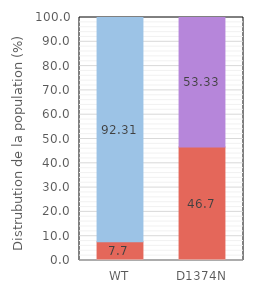
| Category | - | + |
|---|---|---|
| WT | 7.692 | 92.308 |
| D1374N | 46.667 | 53.333 |